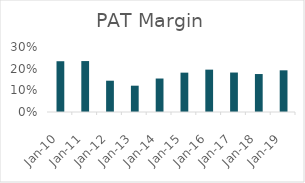
| Category | NPM% |
|---|---|
| 2010-03-31 | 0.234 |
| 2011-03-31 | 0.235 |
| 2012-03-31 | 0.144 |
| 2013-03-31 | 0.121 |
| 2014-03-31 | 0.155 |
| 2015-03-31 | 0.182 |
| 2016-03-31 | 0.196 |
| 2017-03-31 | 0.182 |
| 2018-03-31 | 0.175 |
| 2019-03-31 | 0.192 |